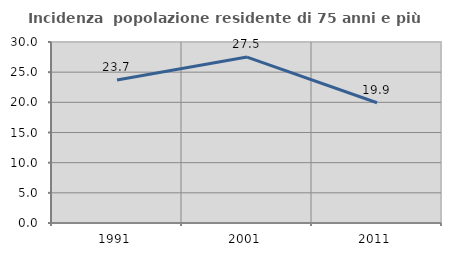
| Category | Incidenza  popolazione residente di 75 anni e più |
|---|---|
| 1991.0 | 23.708 |
| 2001.0 | 27.5 |
| 2011.0 | 19.935 |